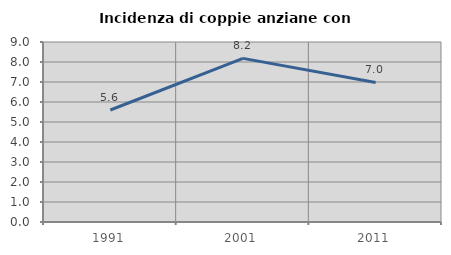
| Category | Incidenza di coppie anziane con figli |
|---|---|
| 1991.0 | 5.6 |
| 2001.0 | 8.182 |
| 2011.0 | 6.977 |